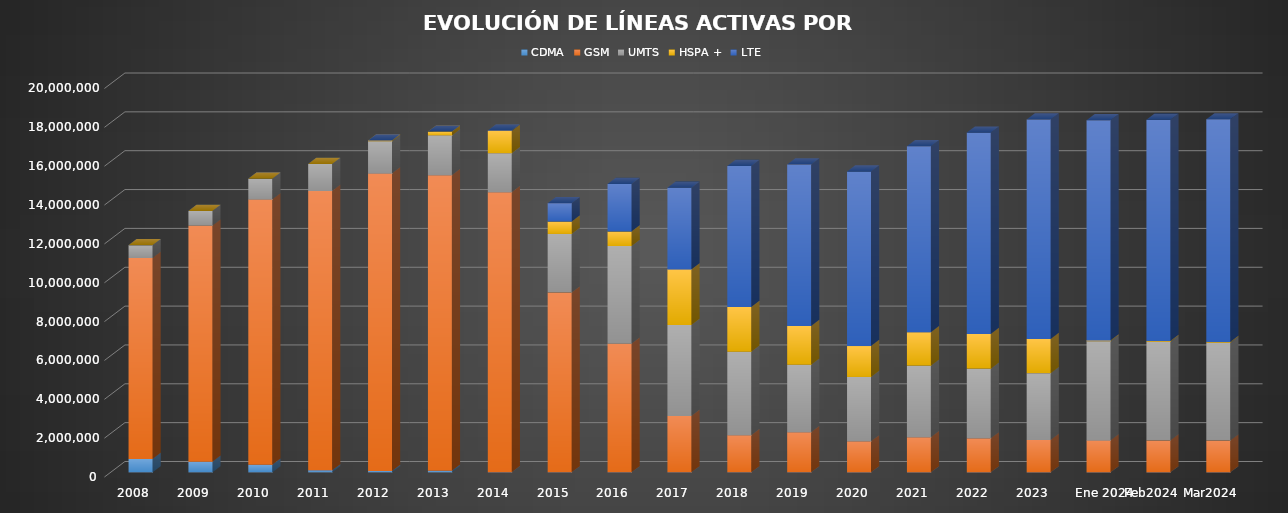
| Category | CDMA | GSM | UMTS | HSPA + | LTE |
|---|---|---|---|---|---|
| 2008 | 688357 | 10346902 | 656989 | 0 | 0 |
| 2009 | 544313 | 12151710 | 758577 | 0 | 0 |
| 2010 | 389834 | 13657394 | 1071603 | 0 | 0 |
| 2011 | 102115 | 14379423 | 1393020 | 0 | 0 |
| 2012 | 75179 | 15310006 | 1658596 | 43082 | 0 |
| 2013 | 83748 | 15215287 | 2043321 | 199398 | 0 |
| 2014 | 3009 | 14418144 | 2006405 | 1148823 | 28176 |
| 2015 | 0 | 9252920 | 3019889 | 636488 | 949723 |
| 2016 | 0 | 6621574 | 5027714 | 748032 | 2450814 |
| 2017 | 0 | 2903370.634 | 4688270.066 | 2852941.199 | 4206822.101 |
| 2018 | 0 | 1909938.891 | 4302462.415 | 2301651 | 7258785.694 |
| 2019 | 0 | 2068130.505 | 3468519.705 | 1995507 | 8320942.79 |
| 2020 | 0 | 1595680.621 | 3315009.099 | 1591073 | 8983603.28 |
| 2021 | 0 | 1804531 | 3688873 | 1717066 | 9579130 |
| 2022 | 0 | 1749209.536 | 3590258.283 | 1786029 | 10365254.181 |
| 2023 | 0 | 1668877.551 | 3437383.873 | 1762453 | 11296897.576 |
| Ene 2024 | 0 | 1645802.743 | 5104715.025 | 39987 | 11339124.231 |
| Feb2024 | 0 | 1639335.297 | 5081206.083 | 39954 | 11388619.62 |
| Mar2024 | 0 | 1634223.732 | 5038484.414 | 39942 | 11460126.854 |